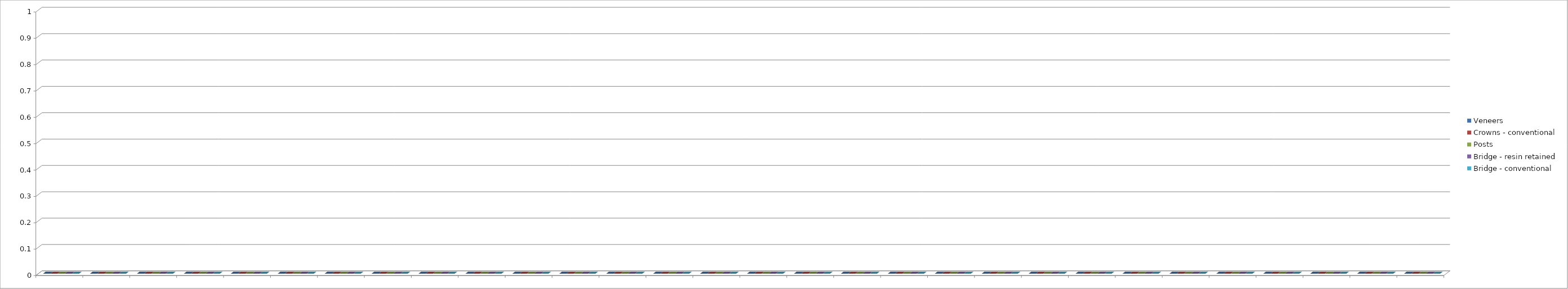
| Category | Veneers | Crowns - conventional | Posts | Bridge - resin retained | Bridge - conventional |
|---|---|---|---|---|---|
| 0 | 0 | 0 | 0 | 0 | 0 |
| 1 | 0 | 0 | 0 | 0 | 0 |
| 2 | 0 | 0 | 0 | 0 | 0 |
| 3 | 0 | 0 | 0 | 0 | 0 |
| 4 | 0 | 0 | 0 | 0 | 0 |
| 5 | 0 | 0 | 0 | 0 | 0 |
| 6 | 0 | 0 | 0 | 0 | 0 |
| 7 | 0 | 0 | 0 | 0 | 0 |
| 8 | 0 | 0 | 0 | 0 | 0 |
| 9 | 0 | 0 | 0 | 0 | 0 |
| 10 | 0 | 0 | 0 | 0 | 0 |
| 11 | 0 | 0 | 0 | 0 | 0 |
| 12 | 0 | 0 | 0 | 0 | 0 |
| 13 | 0 | 0 | 0 | 0 | 0 |
| 14 | 0 | 0 | 0 | 0 | 0 |
| 15 | 0 | 0 | 0 | 0 | 0 |
| 16 | 0 | 0 | 0 | 0 | 0 |
| 17 | 0 | 0 | 0 | 0 | 0 |
| 18 | 0 | 0 | 0 | 0 | 0 |
| 19 | 0 | 0 | 0 | 0 | 0 |
| 20 | 0 | 0 | 0 | 0 | 0 |
| 21 | 0 | 0 | 0 | 0 | 0 |
| 22 | 0 | 0 | 0 | 0 | 0 |
| 23 | 0 | 0 | 0 | 0 | 0 |
| 24 | 0 | 0 | 0 | 0 | 0 |
| 25 | 0 | 0 | 0 | 0 | 0 |
| 26 | 0 | 0 | 0 | 0 | 0 |
| 27 | 0 | 0 | 0 | 0 | 0 |
| 28 | 0 | 0 | 0 | 0 | 0 |
| 29 | 0 | 0 | 0 | 0 | 0 |